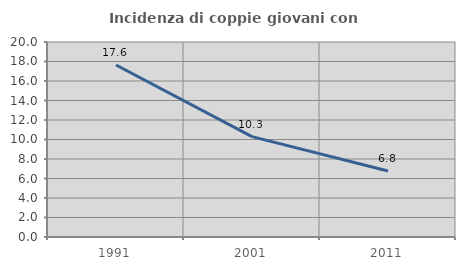
| Category | Incidenza di coppie giovani con figli |
|---|---|
| 1991.0 | 17.645 |
| 2001.0 | 10.296 |
| 2011.0 | 6.769 |